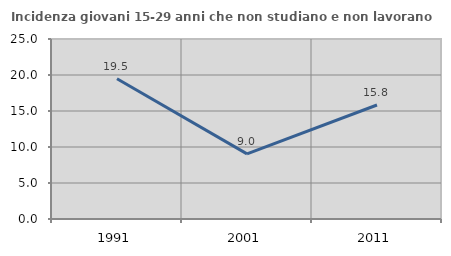
| Category | Incidenza giovani 15-29 anni che non studiano e non lavorano  |
|---|---|
| 1991.0 | 19.469 |
| 2001.0 | 9.044 |
| 2011.0 | 15.835 |